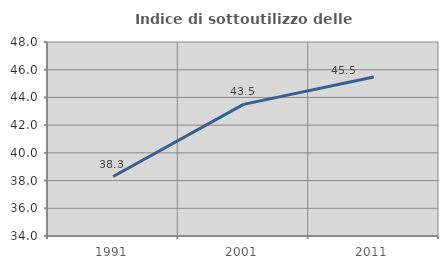
| Category | Indice di sottoutilizzo delle abitazioni  |
|---|---|
| 1991.0 | 38.29 |
| 2001.0 | 43.501 |
| 2011.0 | 45.469 |